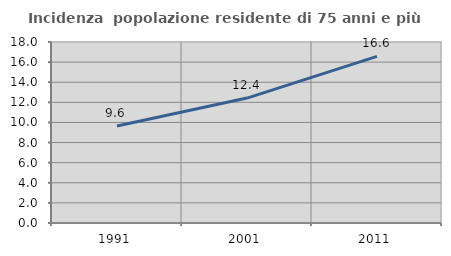
| Category | Incidenza  popolazione residente di 75 anni e più |
|---|---|
| 1991.0 | 9.643 |
| 2001.0 | 12.422 |
| 2011.0 | 16.57 |